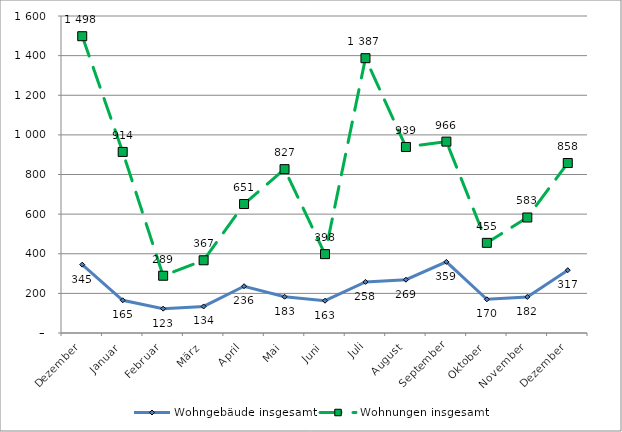
| Category | Wohngebäude insgesamt | Wohnungen insgesamt |
|---|---|---|
| Dezember | 345 | 1498 |
| Januar | 165 | 914 |
| Februar | 123 | 289 |
| März | 134 | 367 |
| April | 236 | 651 |
| Mai | 183 | 827 |
| Juni | 163 | 398 |
| Juli | 258 | 1387 |
| August | 269 | 939 |
| September | 359 | 966 |
| Oktober | 170 | 455 |
| November | 182 | 583 |
| Dezember | 317 | 858 |